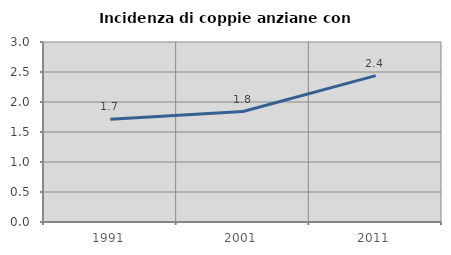
| Category | Incidenza di coppie anziane con figli |
|---|---|
| 1991.0 | 1.714 |
| 2001.0 | 1.84 |
| 2011.0 | 2.439 |